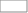
| Category | DIXIE PINEVIEW HURRICANE SNOW CYN DESERT HILLS WATER CYN MILLCREEK ENTERPRISE PRE-SCHs |
|---|---|
| 21.0 | 0 |